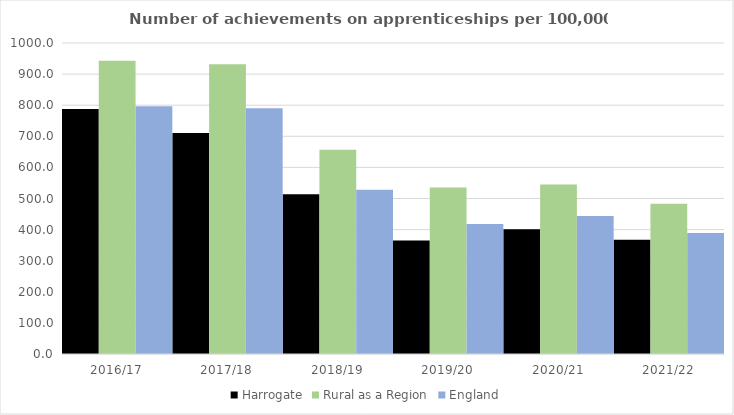
| Category | Harrogate | Rural as a Region | England |
|---|---|---|---|
| 2016/17 | 788 | 942.594 | 797 |
| 2017/18 | 711 | 931.709 | 790 |
| 2018/19 | 514 | 656.44 | 528 |
| 2019/20 | 365 | 535.552 | 418 |
| 2020/21 | 401 | 545.333 | 444 |
| 2021/22 | 367 | 482.936 | 389 |